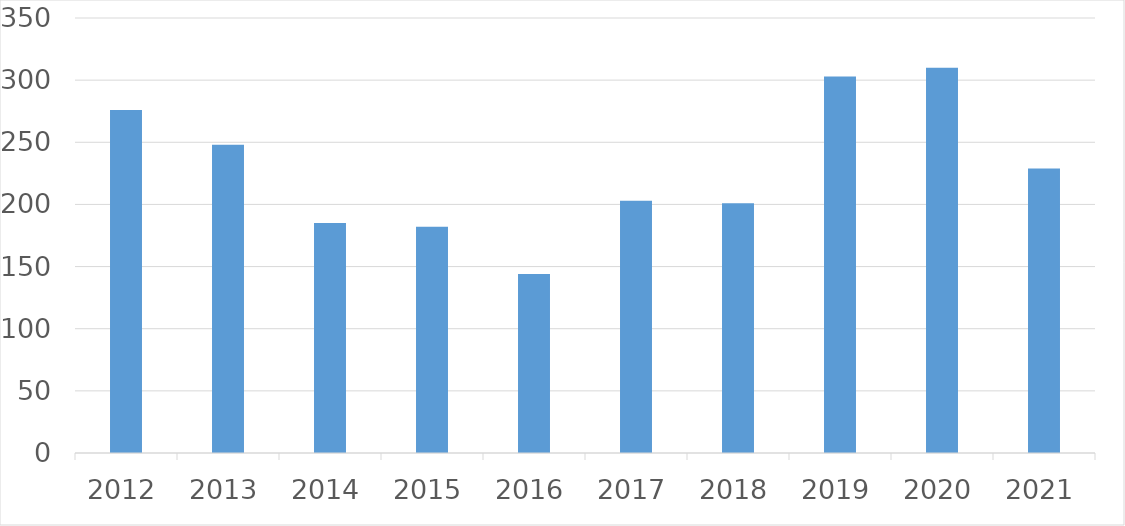
| Category | Series 0 |
|---|---|
| 2012 | 276 |
| 2013 | 248 |
| 2014 | 185 |
| 2015 | 182 |
| 2016 | 144 |
| 2017 | 203 |
| 2018 | 201 |
| 2019 | 303 |
| 2020 | 310 |
| 2021 | 229 |